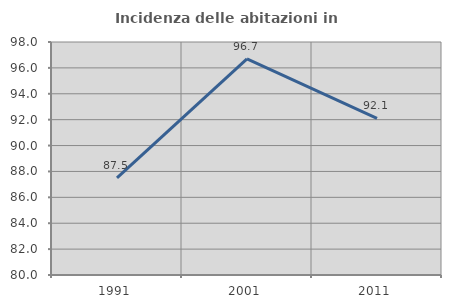
| Category | Incidenza delle abitazioni in proprietà  |
|---|---|
| 1991.0 | 87.5 |
| 2001.0 | 96.694 |
| 2011.0 | 92.105 |